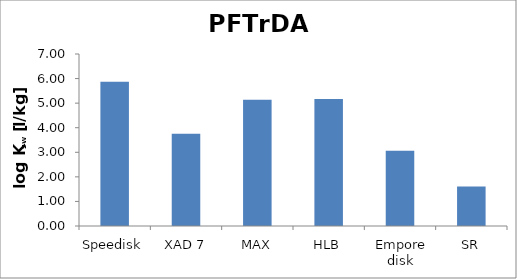
| Category | PFTrDA  |
|---|---|
| Speedisk | 5.869 |
| XAD 7 | 3.75 |
| MAX | 5.136 |
| HLB | 5.165 |
| Empore disk | 3.061 |
| SR | 1.605 |